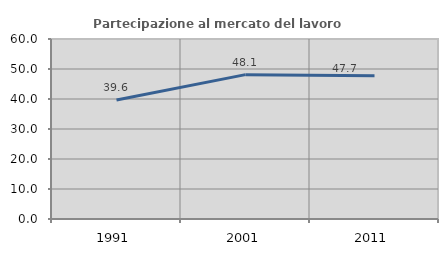
| Category | Partecipazione al mercato del lavoro  femminile |
|---|---|
| 1991.0 | 39.64 |
| 2001.0 | 48.12 |
| 2011.0 | 47.727 |